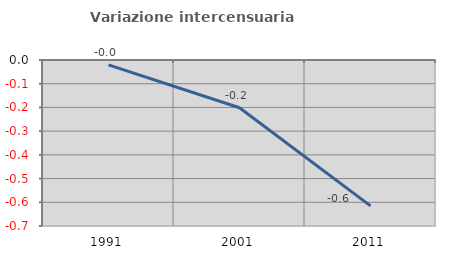
| Category | Variazione intercensuaria annua |
|---|---|
| 1991.0 | -0.02 |
| 2001.0 | -0.201 |
| 2011.0 | -0.615 |